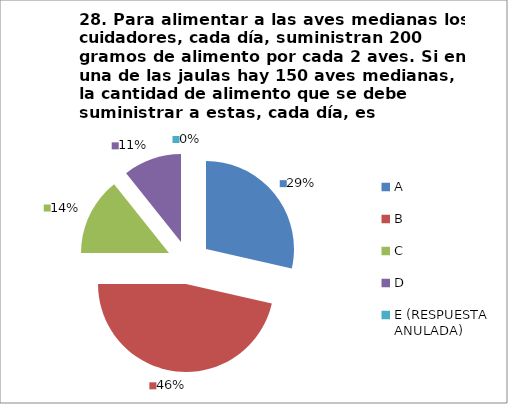
| Category | CANTIDAD DE RESPUESTAS PREGUNTA (28) | PORCENTAJE |
|---|---|---|
| A | 8 | 0.286 |
| B | 13 | 0.464 |
| C | 4 | 0.143 |
| D | 3 | 0.107 |
| E (RESPUESTA ANULADA) | 0 | 0 |